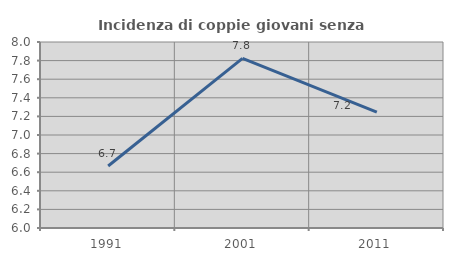
| Category | Incidenza di coppie giovani senza figli |
|---|---|
| 1991.0 | 6.667 |
| 2001.0 | 7.823 |
| 2011.0 | 7.246 |